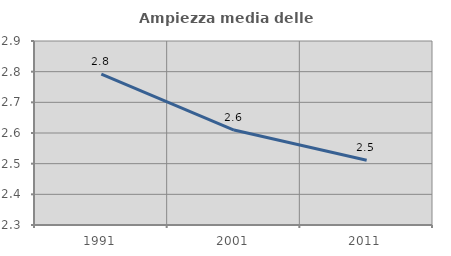
| Category | Ampiezza media delle famiglie |
|---|---|
| 1991.0 | 2.792 |
| 2001.0 | 2.61 |
| 2011.0 | 2.511 |